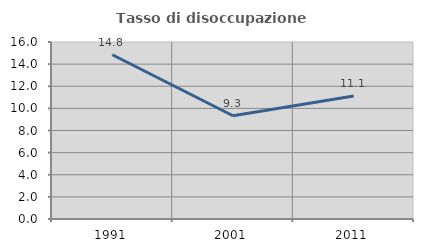
| Category | Tasso di disoccupazione giovanile  |
|---|---|
| 1991.0 | 14.847 |
| 2001.0 | 9.333 |
| 2011.0 | 11.111 |